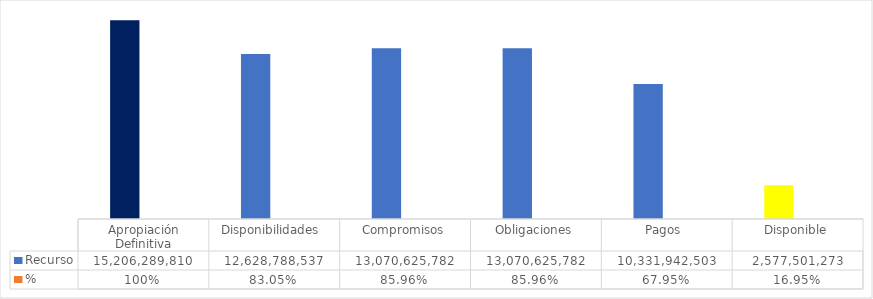
| Category | Recurso  | % |
|---|---|---|
| Apropiación Definitiva | 15206289810.39 | 1 |
| Disponibilidades  | 12628788537.17 | 0.83 |
| Compromisos | 13070625781.74 | 0.86 |
| Obligaciones | 13070625781.74 | 0.86 |
| Pagos  | 10331942502.95 | 0.679 |
| Disponible | 2577501273.22 | 0.17 |